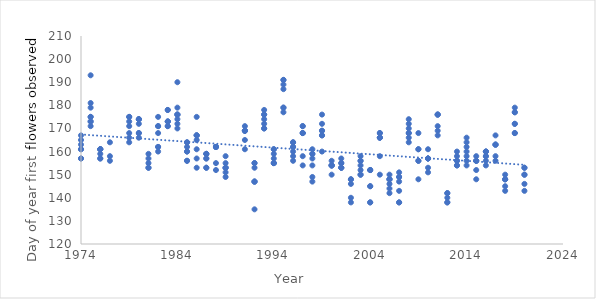
| Category | firstfl.doy |
|---|---|
| 1974.0 | 167 |
| 1974.0 | 157 |
| 1974.0 | 161 |
| 1974.0 | 165 |
| 1974.0 | 163 |
| 1974.0 | 157 |
| 1974.0 | 161 |
| 1975.0 | 181 |
| 1975.0 | 171 |
| 1975.0 | 173 |
| 1975.0 | 179 |
| 1975.0 | 175 |
| 1975.0 | 175 |
| 1975.0 | 173 |
| 1975.0 | 193 |
| 1976.0 | 161 |
| 1976.0 | 157 |
| 1976.0 | 161 |
| 1976.0 | 161 |
| 1976.0 | 161 |
| 1976.0 | 159 |
| 1976.0 | 157 |
| 1977.0 | 156 |
| 1977.0 | 158 |
| 1977.0 | 164 |
| 1979.0 | 175 |
| 1979.0 | 166 |
| 1979.0 | 171 |
| 1979.0 | 175 |
| 1979.0 | 173 |
| 1979.0 | 168 |
| 1979.0 | 164 |
| 1980.0 | 174 |
| 1980.0 | 166 |
| 1980.0 | 172 |
| 1980.0 | 174 |
| 1980.0 | 174 |
| 1980.0 | 168 |
| 1980.0 | 168 |
| 1981.0 | 159 |
| 1981.0 | 153 |
| 1981.0 | 153 |
| 1981.0 | 155 |
| 1981.0 | 157 |
| 1982.0 | 175 |
| 1982.0 | 160 |
| 1982.0 | 168 |
| 1982.0 | 171 |
| 1982.0 | 171 |
| 1982.0 | 162 |
| 1982.0 | 162 |
| 1983.0 | 178 |
| 1983.0 | 171 |
| 1983.0 | 173 |
| 1983.0 | 173 |
| 1983.0 | 178 |
| 1983.0 | 171 |
| 1983.0 | 173 |
| 1984.0 | 179 |
| 1984.0 | 170 |
| 1984.0 | 176 |
| 1984.0 | 176 |
| 1984.0 | 176 |
| 1984.0 | 174 |
| 1984.0 | 172 |
| 1984.0 | 190 |
| 1985.0 | 164 |
| 1985.0 | 156 |
| 1985.0 | 162 |
| 1985.0 | 164 |
| 1985.0 | 160 |
| 1985.0 | 160 |
| 1985.0 | 156 |
| 1986.0 | 165 |
| 1986.0 | 157 |
| 1986.0 | 167 |
| 1986.0 | 167 |
| 1986.0 | 167 |
| 1986.0 | 161 |
| 1986.0 | 153 |
| 1986.0 | 175 |
| 1987.0 | 157 |
| 1987.0 | 153 |
| 1987.0 | 159 |
| 1987.0 | 159 |
| 1987.0 | 159 |
| 1987.0 | 157 |
| 1987.0 | 153 |
| 1988.0 | 162 |
| 1988.0 | 155 |
| 1988.0 | 162 |
| 1988.0 | 162 |
| 1988.0 | 162 |
| 1988.0 | 152 |
| 1989.0 | 153 |
| 1989.0 | 149 |
| 1989.0 | 153 |
| 1989.0 | 158 |
| 1989.0 | 155 |
| 1989.0 | 151 |
| 1989.0 | 153 |
| 1991.0 | 169 |
| 1991.0 | 169 |
| 1991.0 | 165 |
| 1991.0 | 169 |
| 1991.0 | 169 |
| 1991.0 | 171 |
| 1991.0 | 161 |
| 1992.0 | 147 |
| 1992.0 | 147 |
| 1992.0 | 153 |
| 1992.0 | 155 |
| 1992.0 | 155 |
| 1992.0 | 147 |
| 1992.0 | 135 |
| 1993.0 | 176 |
| 1993.0 | 170 |
| 1993.0 | 174 |
| 1993.0 | 178 |
| 1993.0 | 176 |
| 1993.0 | 172 |
| 1993.0 | 170 |
| 1994.0 | 157 |
| 1994.0 | 155 |
| 1994.0 | 159 |
| 1994.0 | 161 |
| 1994.0 | 161 |
| 1994.0 | 155 |
| 1994.0 | 155 |
| 1995.0 | 187 |
| 1995.0 | 179 |
| 1995.0 | 189 |
| 1995.0 | 191 |
| 1995.0 | 191 |
| 1995.0 | 179 |
| 1995.0 | 177 |
| 1996.0 | 162 |
| 1996.0 | 158 |
| 1996.0 | 164 |
| 1996.0 | 164 |
| 1996.0 | 162 |
| 1996.0 | 160 |
| 1996.0 | 156 |
| 1997.0 | 168 |
| 1997.0 | 158 |
| 1997.0 | 171 |
| 1997.0 | 168 |
| 1997.0 | 171 |
| 1997.0 | 168 |
| 1997.0 | 154 |
| 1998.0 | 157 |
| 1998.0 | 149 |
| 1998.0 | 159 |
| 1998.0 | 159 |
| 1998.0 | 161 |
| 1998.0 | 154 |
| 1998.0 | 147 |
| 1999.0 | 167 |
| 1999.0 | 167 |
| 1999.0 | 172 |
| 1999.0 | 169 |
| 1999.0 | 169 |
| 1999.0 | 176 |
| 1999.0 | 160 |
| 2000.0 | 156 |
| 2000.0 | 154 |
| 2000.0 | 154 |
| 2000.0 | 154 |
| 2000.0 | 154 |
| 2000.0 | 150 |
| 2001.0 | 155 |
| 2001.0 | 153 |
| 2001.0 | 153 |
| 2001.0 | 155 |
| 2001.0 | 157 |
| 2001.0 | 153 |
| 2002.0 | 140 |
| 2002.0 | 138 |
| 2002.0 | 148 |
| 2002.0 | 146 |
| 2002.0 | 148 |
| 2003.0 | 152 |
| 2003.0 | 150 |
| 2003.0 | 158 |
| 2003.0 | 154 |
| 2003.0 | 156 |
| 2003.0 | 156 |
| 2003.0 | 150 |
| 2004.0 | 145 |
| 2004.0 | 138 |
| 2004.0 | 152 |
| 2004.0 | 152 |
| 2004.0 | 152 |
| 2004.0 | 145 |
| 2004.0 | 138 |
| 2005.0 | 166 |
| 2005.0 | 158 |
| 2005.0 | 166 |
| 2005.0 | 168 |
| 2005.0 | 168 |
| 2005.0 | 166 |
| 2005.0 | 150 |
| 2006.0 | 150 |
| 2006.0 | 142 |
| 2006.0 | 148 |
| 2006.0 | 148 |
| 2006.0 | 148 |
| 2006.0 | 146 |
| 2006.0 | 144 |
| 2007.0 | 149 |
| 2007.0 | 138 |
| 2007.0 | 149 |
| 2007.0 | 151 |
| 2007.0 | 147 |
| 2007.0 | 143 |
| 2007.0 | 138 |
| 2008.0 | 174 |
| 2008.0 | 166 |
| 2008.0 | 168 |
| 2008.0 | 172 |
| 2008.0 | 170 |
| 2008.0 | 168 |
| 2008.0 | 164 |
| 2009.0 | 168 |
| 2009.0 | 148 |
| 2009.0 | 156 |
| 2009.0 | 161 |
| 2009.0 | 161 |
| 2009.0 | 156 |
| 2010.0 | 157 |
| 2010.0 | 153 |
| 2010.0 | 151 |
| 2010.0 | 157 |
| 2010.0 | 157 |
| 2010.0 | 157 |
| 2010.0 | 161 |
| 2011.0 | 176 |
| 2011.0 | 167 |
| 2011.0 | 169 |
| 2011.0 | 176 |
| 2011.0 | 176 |
| 2011.0 | 171 |
| 2012.0 | 138 |
| 2012.0 | 142 |
| 2012.0 | 142 |
| 2012.0 | 138 |
| 2012.0 | 140 |
| 2013.0 | 156 |
| 2013.0 | 154 |
| 2013.0 | 156 |
| 2013.0 | 154 |
| 2013.0 | 158 |
| 2013.0 | 160 |
| 2014.0 | 162 |
| 2014.0 | 156 |
| 2014.0 | 164 |
| 2014.0 | 160 |
| 2014.0 | 166 |
| 2014.0 | 158 |
| 2014.0 | 154 |
| 2015.0 | 152 |
| 2015.0 | 148 |
| 2015.0 | 156 |
| 2015.0 | 156 |
| 2015.0 | 158 |
| 2015.0 | 156 |
| 2016.0 | 154 |
| 2016.0 | 156 |
| 2016.0 | 160 |
| 2016.0 | 158 |
| 2016.0 | 160 |
| 2016.0 | 160 |
| 2016.0 | 158 |
| 2017.0 | 163 |
| 2017.0 | 156 |
| 2017.0 | 163 |
| 2017.0 | 163 |
| 2017.0 | 167 |
| 2017.0 | 158 |
| 2018.0 | 148 |
| 2018.0 | 145 |
| 2018.0 | 148 |
| 2018.0 | 150 |
| 2018.0 | 148 |
| 2018.0 | 143 |
| 2019.0 | 177 |
| 2019.0 | 168 |
| 2019.0 | 172 |
| 2019.0 | 179 |
| 2019.0 | 177 |
| 2019.0 | 172 |
| 2019.0 | 168 |
| 2020.0 | 150 |
| 2020.0 | 143 |
| 2020.0 | 153 |
| 2020.0 | 153 |
| 2020.0 | 150 |
| 2020.0 | 146 |